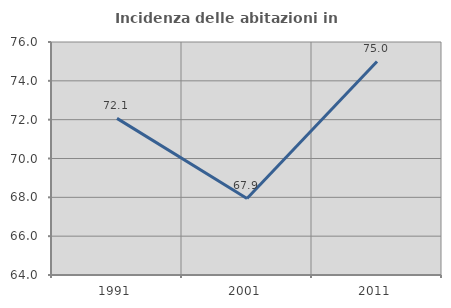
| Category | Incidenza delle abitazioni in proprietà  |
|---|---|
| 1991.0 | 72.067 |
| 2001.0 | 67.943 |
| 2011.0 | 75 |